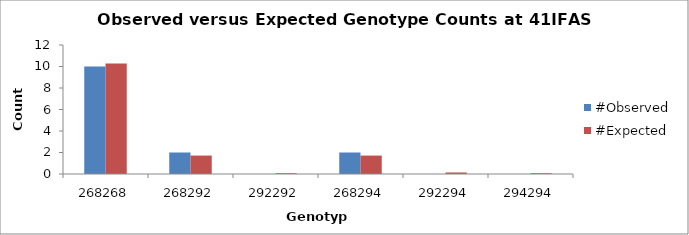
| Category | #Observed | #Expected |
|---|---|---|
| 268268.0 | 10 | 10.286 |
| 268292.0 | 2 | 1.714 |
| 292292.0 | 0 | 0.071 |
| 268294.0 | 2 | 1.714 |
| 292294.0 | 0 | 0.143 |
| 294294.0 | 0 | 0.071 |